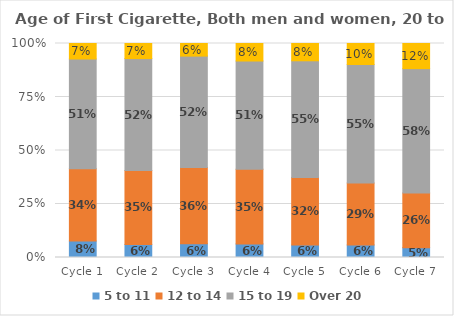
| Category | 5 to 11 | 12 to 14 | 15 to 19 | Over 20 |
|---|---|---|---|---|
| Cycle 1 | 0.077 | 0.338 | 0.513 | 0.072 |
| Cycle 2 | 0.061 | 0.345 | 0.523 | 0.071 |
| Cycle 3 | 0.065 | 0.356 | 0.521 | 0.059 |
| Cycle 4 | 0.064 | 0.349 | 0.506 | 0.082 |
| Cycle 5 | 0.058 | 0.316 | 0.545 | 0.081 |
| Cycle 6 | 0.059 | 0.289 | 0.554 | 0.098 |
| Cycle 7 | 0.046 | 0.256 | 0.581 | 0.117 |